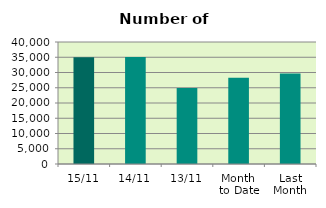
| Category | Series 0 |
|---|---|
| 15/11 | 34960 |
| 14/11 | 35112 |
| 13/11 | 24954 |
| Month 
to Date | 28252.182 |
| Last
Month | 29672.087 |